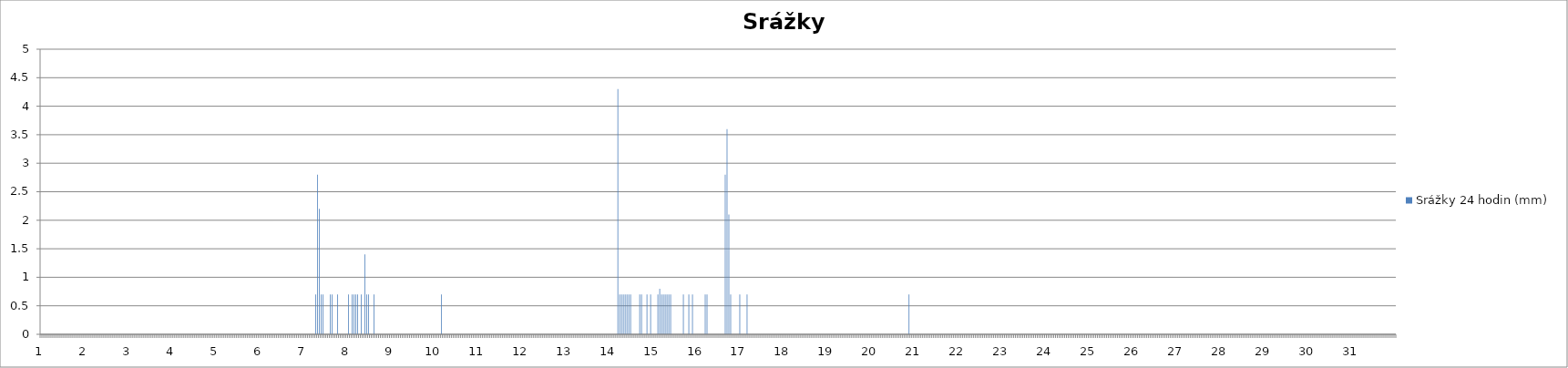
| Category | Srážky 24 hodin (mm) |
|---|---|
| 0 | 0 |
| 1 | 0 |
| 2 | 0 |
| 3 | 0 |
| 4 | 0 |
| 5 | 0 |
| 6 | 0 |
| 7 | 0 |
| 8 | 0 |
| 9 | 0 |
| 10 | 0 |
| 11 | 0 |
| 12 | 0 |
| 13 | 0 |
| 14 | 0 |
| 15 | 0 |
| 16 | 0 |
| 17 | 0 |
| 18 | 0 |
| 19 | 0 |
| 20 | 0 |
| 21 | 0 |
| 22 | 0 |
| 23 | 0 |
| 24 | 0 |
| 25 | 0 |
| 26 | 0 |
| 27 | 0 |
| 28 | 0 |
| 29 | 0 |
| 30 | 0 |
| 31 | 0 |
| 32 | 0 |
| 33 | 0 |
| 34 | 0 |
| 35 | 0 |
| 36 | 0 |
| 37 | 0 |
| 38 | 0 |
| 39 | 0 |
| 40 | 0 |
| 41 | 0 |
| 42 | 0 |
| 43 | 0 |
| 44 | 0 |
| 45 | 0 |
| 46 | 0 |
| 47 | 0 |
| 48 | 0 |
| 49 | 0 |
| 50 | 0 |
| 51 | 0 |
| 52 | 0 |
| 53 | 0 |
| 54 | 0 |
| 55 | 0 |
| 56 | 0 |
| 57 | 0 |
| 58 | 0 |
| 59 | 0 |
| 60 | 0 |
| 61 | 0 |
| 62 | 0 |
| 63 | 0 |
| 64 | 0 |
| 65 | 0 |
| 66 | 0 |
| 67 | 0 |
| 68 | 0 |
| 69 | 0 |
| 70 | 0 |
| 71 | 0 |
| 72 | 0 |
| 73 | 0 |
| 74 | 0 |
| 75 | 0 |
| 76 | 0 |
| 77 | 0 |
| 78 | 0 |
| 79 | 0 |
| 80 | 0 |
| 81 | 0 |
| 82 | 0 |
| 83 | 0 |
| 84 | 0 |
| 85 | 0 |
| 86 | 0 |
| 87 | 0 |
| 88 | 0 |
| 89 | 0 |
| 90 | 0 |
| 91 | 0 |
| 92 | 0 |
| 93 | 0 |
| 94 | 0 |
| 95 | 0 |
| 96 | 0 |
| 97 | 0 |
| 98 | 0 |
| 99 | 0 |
| 100 | 0 |
| 101 | 0 |
| 102 | 0 |
| 103 | 0 |
| 104 | 0 |
| 105 | 0 |
| 106 | 0 |
| 107 | 0 |
| 108 | 0 |
| 109 | 0 |
| 110 | 0 |
| 111 | 0 |
| 112 | 0 |
| 113 | 0 |
| 114 | 0 |
| 115 | 0 |
| 116 | 0 |
| 117 | 0 |
| 118 | 0 |
| 119 | 0 |
| 120 | 0 |
| 121 | 0 |
| 122 | 0 |
| 123 | 0 |
| 124 | 0 |
| 125 | 0 |
| 126 | 0 |
| 127 | 0 |
| 128 | 0 |
| 129 | 0 |
| 130 | 0 |
| 131 | 0 |
| 132 | 0 |
| 133 | 0 |
| 134 | 0 |
| 135 | 0 |
| 136 | 0 |
| 137 | 0 |
| 138 | 0 |
| 139 | 0 |
| 140 | 0 |
| 141 | 0 |
| 142 | 0 |
| 143 | 0 |
| 144 | 0 |
| 145 | 0 |
| 146 | 0 |
| 147 | 0 |
| 148 | 0 |
| 149 | 0 |
| 150 | 0 |
| 151 | 0.7 |
| 152 | 2.8 |
| 153 | 2.2 |
| 154 | 0.7 |
| 155 | 0.7 |
| 156 | 0 |
| 157 | 0 |
| 158 | 0 |
| 159 | 0.7 |
| 160 | 0.7 |
| 161 | 0 |
| 162 | 0 |
| 163 | 0.7 |
| 164 | 0 |
| 165 | 0 |
| 166 | 0 |
| 167 | 0 |
| 168 | 0 |
| 169 | 0.7 |
| 170 | 0 |
| 171 | 0.7 |
| 172 | 0.7 |
| 173 | 0.7 |
| 174 | 0.7 |
| 175 | 0 |
| 176 | 0.7 |
| 177 | 0 |
| 178 | 1.4 |
| 179 | 0.7 |
| 180 | 0.7 |
| 181 | 0 |
| 182 | 0 |
| 183 | 0.7 |
| 184 | 0 |
| 185 | 0 |
| 186 | 0 |
| 187 | 0 |
| 188 | 0 |
| 189 | 0 |
| 190 | 0 |
| 191 | 0 |
| 192 | 0 |
| 193 | 0 |
| 194 | 0 |
| 195 | 0 |
| 196 | 0 |
| 197 | 0 |
| 198 | 0 |
| 199 | 0 |
| 200 | 0 |
| 201 | 0 |
| 202 | 0 |
| 203 | 0 |
| 204 | 0 |
| 205 | 0 |
| 206 | 0 |
| 207 | 0 |
| 208 | 0 |
| 209 | 0 |
| 210 | 0 |
| 211 | 0 |
| 212 | 0 |
| 213 | 0 |
| 214 | 0 |
| 215 | 0 |
| 216 | 0 |
| 217 | 0 |
| 218 | 0 |
| 219 | 0 |
| 220 | 0.7 |
| 221 | 0 |
| 222 | 0 |
| 223 | 0 |
| 224 | 0 |
| 225 | 0 |
| 226 | 0 |
| 227 | 0 |
| 228 | 0 |
| 229 | 0 |
| 230 | 0 |
| 231 | 0 |
| 232 | 0 |
| 233 | 0 |
| 234 | 0 |
| 235 | 0 |
| 236 | 0 |
| 237 | 0 |
| 238 | 0 |
| 239 | 0 |
| 240 | 0 |
| 241 | 0 |
| 242 | 0 |
| 243 | 0 |
| 244 | 0 |
| 245 | 0 |
| 246 | 0 |
| 247 | 0 |
| 248 | 0 |
| 249 | 0 |
| 250 | 0 |
| 251 | 0 |
| 252 | 0 |
| 253 | 0 |
| 254 | 0 |
| 255 | 0 |
| 256 | 0 |
| 257 | 0 |
| 258 | 0 |
| 259 | 0 |
| 260 | 0 |
| 261 | 0 |
| 262 | 0 |
| 263 | 0 |
| 264 | 0 |
| 265 | 0 |
| 266 | 0 |
| 267 | 0 |
| 268 | 0 |
| 269 | 0 |
| 270 | 0 |
| 271 | 0 |
| 272 | 0 |
| 273 | 0 |
| 274 | 0 |
| 275 | 0 |
| 276 | 0 |
| 277 | 0 |
| 278 | 0 |
| 279 | 0 |
| 280 | 0 |
| 281 | 0 |
| 282 | 0 |
| 283 | 0 |
| 284 | 0 |
| 285 | 0 |
| 286 | 0 |
| 287 | 0 |
| 288 | 0 |
| 289 | 0 |
| 290 | 0 |
| 291 | 0 |
| 292 | 0 |
| 293 | 0 |
| 294 | 0 |
| 295 | 0 |
| 296 | 0 |
| 297 | 0 |
| 298 | 0 |
| 299 | 0 |
| 300 | 0 |
| 301 | 0 |
| 302 | 0 |
| 303 | 0 |
| 304 | 0 |
| 305 | 0 |
| 306 | 0 |
| 307 | 0 |
| 308 | 0 |
| 309 | 0 |
| 310 | 0 |
| 311 | 0 |
| 312 | 0 |
| 313 | 0 |
| 314 | 0 |
| 315 | 0 |
| 316 | 0 |
| 317 | 4.3 |
| 318 | 0.7 |
| 319 | 0.7 |
| 320 | 0.7 |
| 321 | 0.7 |
| 322 | 0.7 |
| 323 | 0.7 |
| 324 | 0.7 |
| 325 | 0 |
| 326 | 0 |
| 327 | 0 |
| 328 | 0 |
| 329 | 0.7 |
| 330 | 0.7 |
| 331 | 0 |
| 332 | 0 |
| 333 | 0.7 |
| 334 | 0 |
| 335 | 0.7 |
| 336 | 0 |
| 337 | 0 |
| 338 | 0 |
| 339 | 0.7 |
| 340 | 0.8 |
| 341 | 0.7 |
| 342 | 0.7 |
| 343 | 0.7 |
| 344 | 0.7 |
| 345 | 0.7 |
| 346 | 0.7 |
| 347 | 0 |
| 348 | 0 |
| 349 | 0 |
| 350 | 0 |
| 351 | 0 |
| 352 | 0 |
| 353 | 0.7 |
| 354 | 0 |
| 355 | 0 |
| 356 | 0.7 |
| 357 | 0 |
| 358 | 0.7 |
| 359 | 0 |
| 360 | 0 |
| 361 | 0 |
| 362 | 0 |
| 363 | 0 |
| 364 | 0 |
| 365 | 0.7 |
| 366 | 0.7 |
| 367 | 0 |
| 368 | 0 |
| 369 | 0 |
| 370 | 0 |
| 371 | 0 |
| 372 | 0 |
| 373 | 0 |
| 374 | 0 |
| 375 | 0 |
| 376 | 2.8 |
| 377 | 3.6 |
| 378 | 2.1 |
| 379 | 0.7 |
| 380 | 0 |
| 381 | 0 |
| 382 | 0 |
| 383 | 0 |
| 384 | 0.7 |
| 385 | 0 |
| 386 | 0 |
| 387 | 0 |
| 388 | 0.7 |
| 389 | 0 |
| 390 | 0 |
| 391 | 0 |
| 392 | 0 |
| 393 | 0 |
| 394 | 0 |
| 395 | 0 |
| 396 | 0 |
| 397 | 0 |
| 398 | 0 |
| 399 | 0 |
| 400 | 0 |
| 401 | 0 |
| 402 | 0 |
| 403 | 0 |
| 404 | 0 |
| 405 | 0 |
| 406 | 0 |
| 407 | 0 |
| 408 | 0 |
| 409 | 0 |
| 410 | 0 |
| 411 | 0 |
| 412 | 0 |
| 413 | 0 |
| 414 | 0 |
| 415 | 0 |
| 416 | 0 |
| 417 | 0 |
| 418 | 0 |
| 419 | 0 |
| 420 | 0 |
| 421 | 0 |
| 422 | 0 |
| 423 | 0 |
| 424 | 0 |
| 425 | 0 |
| 426 | 0 |
| 427 | 0 |
| 428 | 0 |
| 429 | 0 |
| 430 | 0 |
| 431 | 0 |
| 432 | 0 |
| 433 | 0 |
| 434 | 0 |
| 435 | 0 |
| 436 | 0 |
| 437 | 0 |
| 438 | 0 |
| 439 | 0 |
| 440 | 0 |
| 441 | 0 |
| 442 | 0 |
| 443 | 0 |
| 444 | 0 |
| 445 | 0 |
| 446 | 0 |
| 447 | 0 |
| 448 | 0 |
| 449 | 0 |
| 450 | 0 |
| 451 | 0 |
| 452 | 0 |
| 453 | 0 |
| 454 | 0 |
| 455 | 0 |
| 456 | 0 |
| 457 | 0 |
| 458 | 0 |
| 459 | 0 |
| 460 | 0 |
| 461 | 0 |
| 462 | 0 |
| 463 | 0 |
| 464 | 0 |
| 465 | 0 |
| 466 | 0 |
| 467 | 0 |
| 468 | 0 |
| 469 | 0 |
| 470 | 0 |
| 471 | 0 |
| 472 | 0 |
| 473 | 0 |
| 474 | 0 |
| 475 | 0 |
| 476 | 0 |
| 477 | 0.7 |
| 478 | 0 |
| 479 | 0 |
| 480 | 0 |
| 481 | 0 |
| 482 | 0 |
| 483 | 0 |
| 484 | 0 |
| 485 | 0 |
| 486 | 0 |
| 487 | 0 |
| 488 | 0 |
| 489 | 0 |
| 490 | 0 |
| 491 | 0 |
| 492 | 0 |
| 493 | 0 |
| 494 | 0 |
| 495 | 0 |
| 496 | 0 |
| 497 | 0 |
| 498 | 0 |
| 499 | 0 |
| 500 | 0 |
| 501 | 0 |
| 502 | 0 |
| 503 | 0 |
| 504 | 0 |
| 505 | 0 |
| 506 | 0 |
| 507 | 0 |
| 508 | 0 |
| 509 | 0 |
| 510 | 0 |
| 511 | 0 |
| 512 | 0 |
| 513 | 0 |
| 514 | 0 |
| 515 | 0 |
| 516 | 0 |
| 517 | 0 |
| 518 | 0 |
| 519 | 0 |
| 520 | 0 |
| 521 | 0 |
| 522 | 0 |
| 523 | 0 |
| 524 | 0 |
| 525 | 0 |
| 526 | 0 |
| 527 | 0 |
| 528 | 0 |
| 529 | 0 |
| 530 | 0 |
| 531 | 0 |
| 532 | 0 |
| 533 | 0 |
| 534 | 0 |
| 535 | 0 |
| 536 | 0 |
| 537 | 0 |
| 538 | 0 |
| 539 | 0 |
| 540 | 0 |
| 541 | 0 |
| 542 | 0 |
| 543 | 0 |
| 544 | 0 |
| 545 | 0 |
| 546 | 0 |
| 547 | 0 |
| 548 | 0 |
| 549 | 0 |
| 550 | 0 |
| 551 | 0 |
| 552 | 0 |
| 553 | 0 |
| 554 | 0 |
| 555 | 0 |
| 556 | 0 |
| 557 | 0 |
| 558 | 0 |
| 559 | 0 |
| 560 | 0 |
| 561 | 0 |
| 562 | 0 |
| 563 | 0 |
| 564 | 0 |
| 565 | 0 |
| 566 | 0 |
| 567 | 0 |
| 568 | 0 |
| 569 | 0 |
| 570 | 0 |
| 571 | 0 |
| 572 | 0 |
| 573 | 0 |
| 574 | 0 |
| 575 | 0 |
| 576 | 0 |
| 577 | 0 |
| 578 | 0 |
| 579 | 0 |
| 580 | 0 |
| 581 | 0 |
| 582 | 0 |
| 583 | 0 |
| 584 | 0 |
| 585 | 0 |
| 586 | 0 |
| 587 | 0 |
| 588 | 0 |
| 589 | 0 |
| 590 | 0 |
| 591 | 0 |
| 592 | 0 |
| 593 | 0 |
| 594 | 0 |
| 595 | 0 |
| 596 | 0 |
| 597 | 0 |
| 598 | 0 |
| 599 | 0 |
| 600 | 0 |
| 601 | 0 |
| 602 | 0 |
| 603 | 0 |
| 604 | 0 |
| 605 | 0 |
| 606 | 0 |
| 607 | 0 |
| 608 | 0 |
| 609 | 0 |
| 610 | 0 |
| 611 | 0 |
| 612 | 0 |
| 613 | 0 |
| 614 | 0 |
| 615 | 0 |
| 616 | 0 |
| 617 | 0 |
| 618 | 0 |
| 619 | 0 |
| 620 | 0 |
| 621 | 0 |
| 622 | 0 |
| 623 | 0 |
| 624 | 0 |
| 625 | 0 |
| 626 | 0 |
| 627 | 0 |
| 628 | 0 |
| 629 | 0 |
| 630 | 0 |
| 631 | 0 |
| 632 | 0 |
| 633 | 0 |
| 634 | 0 |
| 635 | 0 |
| 636 | 0 |
| 637 | 0 |
| 638 | 0 |
| 639 | 0 |
| 640 | 0 |
| 641 | 0 |
| 642 | 0 |
| 643 | 0 |
| 644 | 0 |
| 645 | 0 |
| 646 | 0 |
| 647 | 0 |
| 648 | 0 |
| 649 | 0 |
| 650 | 0 |
| 651 | 0 |
| 652 | 0 |
| 653 | 0 |
| 654 | 0 |
| 655 | 0 |
| 656 | 0 |
| 657 | 0 |
| 658 | 0 |
| 659 | 0 |
| 660 | 0 |
| 661 | 0 |
| 662 | 0 |
| 663 | 0 |
| 664 | 0 |
| 665 | 0 |
| 666 | 0 |
| 667 | 0 |
| 668 | 0 |
| 669 | 0 |
| 670 | 0 |
| 671 | 0 |
| 672 | 0 |
| 673 | 0 |
| 674 | 0 |
| 675 | 0 |
| 676 | 0 |
| 677 | 0 |
| 678 | 0 |
| 679 | 0 |
| 680 | 0 |
| 681 | 0 |
| 682 | 0 |
| 683 | 0 |
| 684 | 0 |
| 685 | 0 |
| 686 | 0 |
| 687 | 0 |
| 688 | 0 |
| 689 | 0 |
| 690 | 0 |
| 691 | 0 |
| 692 | 0 |
| 693 | 0 |
| 694 | 0 |
| 695 | 0 |
| 696 | 0 |
| 697 | 0 |
| 698 | 0 |
| 699 | 0 |
| 700 | 0 |
| 701 | 0 |
| 702 | 0 |
| 703 | 0 |
| 704 | 0 |
| 705 | 0 |
| 706 | 0 |
| 707 | 0 |
| 708 | 0 |
| 709 | 0 |
| 710 | 0 |
| 711 | 0 |
| 712 | 0 |
| 713 | 0 |
| 714 | 0 |
| 715 | 0 |
| 716 | 0 |
| 717 | 0 |
| 718 | 0 |
| 719 | 0 |
| 720 | 0 |
| 721 | 0 |
| 722 | 0 |
| 723 | 0 |
| 724 | 0 |
| 725 | 0 |
| 726 | 0 |
| 727 | 0 |
| 728 | 0 |
| 729 | 0 |
| 730 | 0 |
| 731 | 0 |
| 732 | 0 |
| 733 | 0 |
| 734 | 0 |
| 735 | 0 |
| 736 | 0 |
| 737 | 0 |
| 738 | 0 |
| 739 | 0 |
| 740 | 0 |
| 741 | 0 |
| 742 | 0 |
| 743 | 0 |
| 744 | 0 |